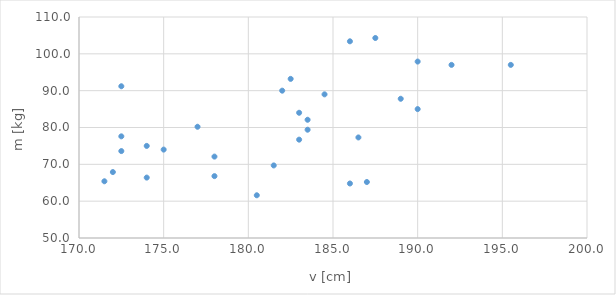
| Category | těl. hmotnost [kg] |
|---|---|
| 171.5 | 65.4 |
| 172.5 | 73.6 |
| 178.0 | 72.1 |
| 187.0 | 65.2 |
| 177.0 | 80.2 |
| 186.5 | 77.3 |
| 183.0 | 84 |
| 174.0 | 66.4 |
| 183.0 | 76.7 |
| 195.5 | 97 |
| 181.5 | 69.7 |
| 172.0 | 67.9 |
| 174.0 | 75 |
| 184.5 | 89 |
| 172.5 | 91.2 |
| 183.5 | 82.1 |
| 186.0 | 64.8 |
| 186.0 | 103.4 |
| 172.5 | 77.6 |
| 180.5 | 61.6 |
| 192.0 | 97 |
| 175.0 | 74 |
| 182.0 | 90 |
| 189.0 | 87.8 |
| 183.5 | 79.4 |
| 182.5 | 93.2 |
| 190.0 | 85 |
| 178.0 | 66.8 |
| 190.0 | 97.9 |
| 187.5 | 104.3 |